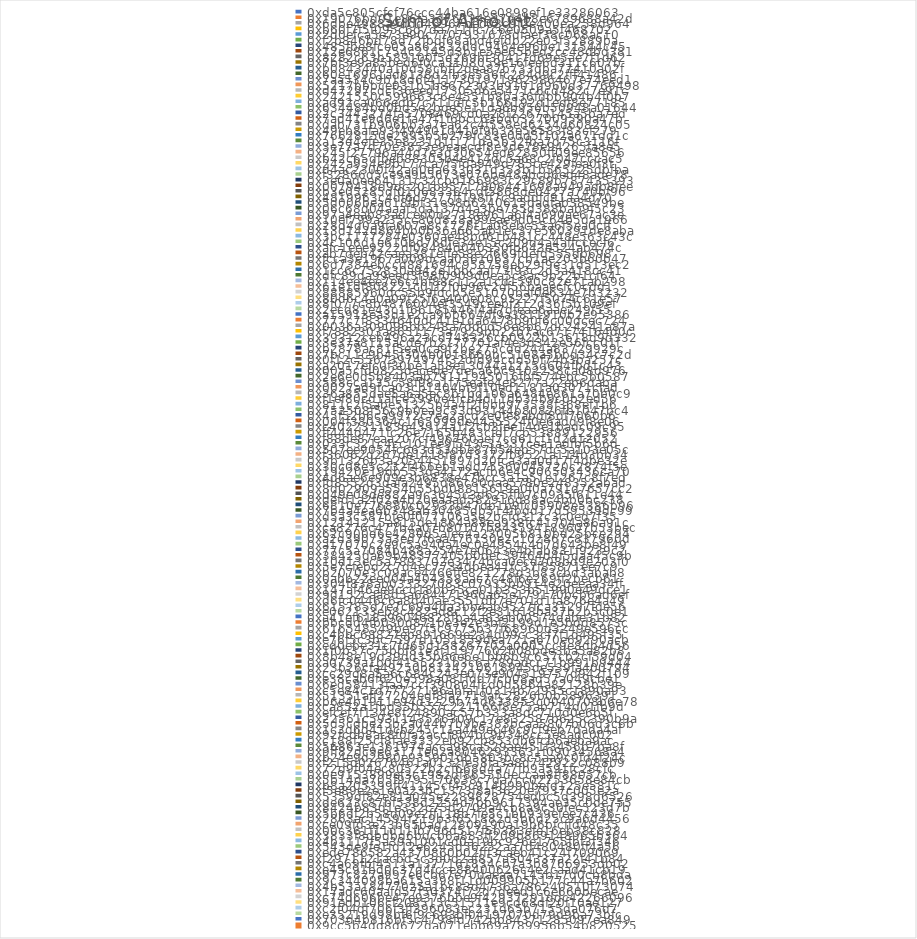
| Category | Sum of Amount |
|---|---|
| 0xda5c805cfcf76ccc44ba616e0898ef1e33286063 | 77777.7 |
| 0x19076bd01e86fa3d76334e27d4b8e6789688a42d | 38157.055 |
| 0x6dbe4988a9ddd46967bec08c9f2e400ea258d964 | 9176.822 |
| 0xb60f7f5f095c6d7da711ffc7c6e0509a5f468702 | 8490 |
| 0x2d0efca5e73e90c7707931678dfaef38c068ac10 | 8440 |
| 0xf2b846bd78d72fbdf68abd4efdb22e03f52889ba | 6846.5 |
| 0x485fbe8fce05a862832ddc9464e96be131544c45 | 5000.5 |
| 0x12e6861c754c2145d3b1e5ee65bed2cc48dbd381 | 3651 |
| 0x8282c63b589100f5d269bf30417d69e5ae7f1d62 | 2997.989 |
| 0x7bf3e9a85bed6f0ca5108059e16fee6d311c607b | 2997.609 |
| 0xb0843440a10d58cbff2dea87b733dba77410a02f | 2510 |
| 0x60e16961ad6138d2fb3e556fc284d9c2fff41486 | 2000 |
| 0x7aa534c9b18d6f4117301971962986467e74eed1 | 2000 |
| 0x5217bbbce031b5b8672303b9101d960d37769498 | 2000 |
| 0xd47297cdcf36eed17305d6a5471c6cd482c7e91c | 2000 |
| 0x2421550c599663c6e4551b8ba36fdbb904b4f0b7 | 2000 |
| 0xad92ca066edb7c711dfc5b166192d1edf8e77185 | 2000 |
| 0x634484bd0bd5e2bde5e11da6b956b50948a01644 | 2000 |
| 0x2c3443274fa5708469cd0a28f2267a145a5ba7ed | 1999 |
| 0x7ad41e9d6e1fa47f1f6bcc63bd0327009590a47b | 1916 |
| 0xdab731b906bb3a7ea62c4f558ed6254d60824c05 | 1519.89 |
| 0x49eb8afa93f494901d410f9b33e58583f83cf279 | 1501.02 |
| 0x76628150e2995b5b279fc83e0dd5f102a671dd1c | 1450 |
| 0xa13d4efe35e8231d1f171da5b32fba7d75c3116f | 1300 |
| 0x3e77a7d70e3853e9eaecdf8e3de78e94265fa8e5 | 1188.5 |
| 0x245f27796a44d7e3d30654ed62850ff09ee85656 | 1100 |
| 0xb42c65dfbeb88305b4e414dc5a68c2f047cccac5 | 1100 |
| 0x242a954e9b177ca7f5fda949d785ce429fea0f3f | 1068.868 |
| 0xd4ac2300f42ad0da633031d353b1b565225dbfba | 1001 |
| 0xf32866d5ce9a9b5673e076be48abcd6ed48ade78 | 1000 |
| 0x3e0adee64131c32cbd166983c29c89b787435393 | 1000 |
| 0x0079418d9dc201b95717806441698a949adb8fee | 1000 |
| 0xb3e05285df010683364cdf5868de0427a740bf96 | 1000 |
| 0x4819963c4df6d7277ff198ff7c9addfc91aa4d70 | 1000 |
| 0x5d006bea618fbf31e98d6240615dadfab38549be | 989 |
| 0x06c68d04aaaf5da137d4a3be785d388bab9f5c23 | 980 |
| 0x97a4eab83adced0d2718e961a6f4a690ae67ac3e | 949 |
| 0x10ef799a235cc80d828a99eae9d05c64b5da1966 | 910.877 |
| 0x28d4d0a9fa607a8c1726f1a08ebc55a6f5ea0cff | 901 |
| 0x13d142d864bb0b36a665ab1ec37e560391de8aba | 815.7 |
| 0x3bc1177284e0360ae48bd61b481cc448e563c43c | 779 |
| 0x4c106d1e610bd76dfe34e15c209d4a4affccecf6 | 713 |
| 0xafc1eee9222df08484d040350fb643e524ab474c | 700 |
| 0xab7deb42caea381effe58e2f669fdefd555db698 | 699 |
| 0xfcca3e1967a009dcaa05610637cb1ae203b60b47 | 614 |
| 0x6d7384ebccd881694c958758eb29f9e31d513ec2 | 600.004 |
| 0x1cc6c752830a942e1bbcaaf73f93c2d3a418cc41 | 599 |
| 0xdfc89da99eed3f98f0909d0ea5c8ac9b22b1cf64 | 550 |
| 0x114ee4ee7e6c4bf88c112a1cd1590c82e71ab298 | 501 |
| 0x61e1df808221c01f2f0b96c2df56baaecfc0cdd1 | 500 |
| 0x88885960dc55b9fdcb5e51070baf0e634e7b3232 | 500 |
| 0x80d6c4a0a09f25f6a400e08c95227f5074c61e57 | 500 |
| 0x8f077c8b4876004ef3549ceebf312d36f5b109ef | 500 |
| 0x2ecd81e43c1f66185446f4af7dfeaa6aae249f55 | 500 |
| 0xa15913ea3d1e2ca9bb664df9a3811910b2e95386 | 500 |
| 0x777c7f8334640dc41e1da6478b90f6c00dcec724 | 499.8 |
| 0x0036a309096bb248a7ddcd56e8b67dc24241a87a | 499 |
| 0xf7882303a8651173a7929bb22b7ac67174164d0c | 499 |
| 0x39312ceb496a23cd748326cb0922b13618d9d332 | 485 |
| 0x3e37a8115acde7b2777701af4e3d342e56fcc01f | 476 |
| 0xb2878ac81f5ea0ca9f2be275cdd244a83729929c | 463.671 |
| 0x7bc11c9b45f304b0018669bc5108a5bbd34c7c2d | 450 |
| 0x0f12c55673974974f32dfd94cdd50f74b3ba257c | 450 |
| 0xa2017efc0f30be1a58e13044a1215d604fbd1c43 | 434.244 |
| 0x00a5cfd0825dacede7deca6bc9102238ca08d976 | 415 |
| 0x2e6e0d5b8403ab79111945016fbf574ebc5b0587 | 409 |
| 0x588cca135c58f98a1f75eafe4e8277a22eb6daba | 400 |
| 0x0027ad9fca03cb1404bf9f10ed1181a03071cfad | 400 |
| 0x36a855dae5a6a5ec8b1bd106a6484e861a70b0c9 | 400 |
| 0xf1ef80cd1afce5990e4fcd4d11db34b9c0b2ed56 | 400 |
| 0x811c2f5abe51325b4a4f2fbbb973538f368ef1b6 | 399.997 |
| 0x752508f56c9b0ea9c53d93144b80826fb1047bc4 | 393 |
| 0x45f52b6ca9972c7ea2acd2e0fe8abdf8df7060b6 | 362.498 |
| 0x004f380364c1f65999de44a5524f0e6add9f8e06 | 355 |
| 0xc402231183643914a1f2cb3fee14de1badc09c95 | 350 |
| 0xff444d471fc26e7165b483cfdf7cb53889122956 | 345 |
| 0xf88de87eaa207cf496760aef7cd61cf1d2d12052 | 330 |
| 0x033c321c4cc101ee9f543c3a337cea1adfbf5b6d | 327 |
| 0x507ee9054fc663d53dbe87b54eb57dc5a103e05c | 309 |
| 0xf36062d267de1418f87d3372fb9521a114b3bb34 | 308 |
| 0x9b1326b3a2054451897d20fca3aa0d17f4dbe32e | 300 |
| 0x30c08e5c232f466eb1add75560045720c2874f5e | 300 |
| 0x19420e19db553da4172acfb6e4c906503436ca70 | 300 |
| 0x4d6ae6e909e3b6838e47bcc3a1a51e1267c8f7ed | 300 |
| 0xfd8552d3dafa2495d86c80daa5780e248352abad | 300 |
| 0x8d02909a554d55bd08815619a0f0a791d7657cc2 | 297 |
| 0xd49e08de882a9c3645c3d625ffb7c0935f611e44 | 280 |
| 0xdefd1a2f02a4b20eaaad582916d88ac4bb0bc238 | 280 |
| 0x6810e776880c02933d47db1b9fc05908e5386b96 | 262.1 |
| 0x7b4a4ea6b348ab30485db514fbdd17d59539dc99 | 260 |
| 0xd5a3c587bfe0f077106a5e2bcfd312c3c0ed7f35 | 250 |
| 0x12141215a815de1864a88ea938fc41704a86a91c | 250 |
| 0xca8276c477b4a07b80107b843594189607b53bec | 250 |
| 0x62c900d6e4280d5afec4a23005b810bd25bce294 | 246.997 |
| 0xa2d39073a3ed7f6aa476130e2c102867c837960d | 215.4 |
| 0xa17070c2e9c5a940a4ec0e4954c4d7d643be8f49 | 210 |
| 0x77c5a7084b488a254e7e0643e4bfab831f9239c2 | 206 |
| 0x38425da69b48377405b0dec39464d4f5daa45c9b | 204 |
| 0x10d13ec5a7893702e3474bca0ecd708bd9e203f0 | 200.5 |
| 0x5e7cfebd2c7d4ec7734dbea41fc37f85871ee7c9 | 200 |
| 0xb2070e3c09ace4466ffe821278d3b83cbd3abab8 | 200 |
| 0x0abb22eed04a404358aac7c48f6e269ff2becb61 | 200 |
| 0x304f838ab033327083c07935bb914e20eeaa34ff | 200 |
| 0x147af46ae9ccd18bb35ca01b353b51990e49dce1 | 200 |
| 0x9d152caa8d5a684471966a65e179170bcb6ad6ef | 200 |
| 0xd6fc0446c6a8d40ae3551db7e701d1fa876e4a49 | 200 |
| 0x615785d7e7c69a4da3bb4ab9527fca31297fde56 | 200 |
| 0xe062133eb8c482ad8c12f2e31618ba37b2b5c0e1 | 200 |
| 0xa41ef618a96046828fba4a83eb00574dabe31b82 | 200 |
| 0xbbcdd4fb030d871be3e2e3bf2199d1e5bdd8573c | 200 |
| 0x616548549be97f5c9775b37f68960d3249e596cc | 199.995 |
| 0xc4bbc68827eb891669e234d09cc3cf7f1d495f35 | 199 |
| 0xe76f5c3bc7597d1051859dea721a670e69290acb | 194 |
| 0xed0ebe31c7fd65d158267702a0005cc9e8db4d56 | 190 |
| 0x1f0b37c75bbf81e3f11977602b08bde3ba5a82b8 | 175 |
| 0x8b48e19d39dd35b66e6e1bb6b9c657cb2cf59d04 | 172 |
| 0xa0739a1b0f4155231b3c6a789adcc71b991b9444 | 160.083 |
| 0x23b26cfa49250b8124210618945de539fa400794 | 159.5 |
| 0xcc29d8a5a6c684c243e073e904519757d942f109 | 155 |
| 0xe38cab6f620e598a081fdd7fcb08ad57a049cbe1 | 155 |
| 0x6ed58413faa7ccf390804fcd0d5864a82128b39e | 152 |
| 0xc5e84c1d77727196abfa1f0314b72935c1890a93 | 150 |
| 0x51351aff27204edf8fa2719afc2826b0b5896391 | 150 |
| 0xb6e4b1911e94d3229b74d633853c0040708b6e78 | 150 |
| 0xca852a1fbd35b557c221166f8e75ab714d01fb9d | 150 |
| 0xefcef7f134e8f24890ac57b333a8dc710d0e6b5f | 150 |
| 0x22561c5931143536309c17e832587b625c390b9a | 150 |
| 0x5d5cdbe25b2a044b7b9be383bcaa5807b06d3c6b | 150 |
| 0x1c3d6d41dcb245c11a449ec46c9cf9eb7dada4af | 150 |
| 0x92fcdb8ac8f0fa2accf8b4bc9b348cc5e8adc002 | 150 |
| 0xc188f25cf8fae3332eb92cb853db6fcb6aeba9ac | 150 |
| 0x56863e1361974acca98ca529ae451f3456b7ba8f | 149.99 |
| 0x9ff82dc9e63171e02a80462933631f09034568a4 | 147.5 |
| 0xb24e9d2980e935901db5803bc8c5aa9c0fd4f24c | 141.4 |
| 0xf215d02676461a0132fe58fa3a8d742922c088b9 | 140 |
| 0x72d9f04ec80522b2cf668d4a77fb9a591fc28cfc | 137.8 |
| 0x0e9153899ef3c1982df86555deccaa8ff88057cb | 137 |
| 0x5b14da705f9795170638c7da7cc02753658e84cb | 134 |
| 0xb8a205399ff41145cf45c914b990befd125e581c | 134 |
| 0xf5e89e2e1e0a23bc1373f8af3620e7937c005e2a | 132.91 |
| 0x5359df82e81a045e2289828754edbc5d398d6526 | 132 |
| 0xde623c87bf538d2254d7bb9617394ae35c0de755 | 130 |
| 0x8424b83d1e332c75d2709a4cb8a9c30fec523d7b | 129.5 |
| 0x5b6df2b58d09e2ff118b7fe5c1bb939efee7c436 | 127 |
| 0x2863ac14594f219b3f651882d5b6d25c9a6d4456 | 127 |
| 0xce09fd3e23b65bad12809190a19b6bfcffd48c35 | 125 |
| 0x00c361f11d11fb796d517f5b383efe16eb38c828 | 120.006 |
| 0x3833f8dbdbd6bdcb6a883ff209b869148965b364 | 120 |
| 0x4b1117f5a39a1001cd0a19bc926e1765fbf3f346 | 120 |
| 0x543de9fe1fd12e6245d56252aa7d480480ff4a56 | 120 |
| 0xede786582a4370860b02fff3caeb41c24f709069 | 115.7 |
| 0xf2971121acbd3c3d0d2af857a504337a22f41b84 | 110 |
| 0xc4a69fbf4511a1377161834cb7a3b8766953db02 | 109 |
| 0xe45c91bd0c37d4fcce88400626c4e2caad41cb19 | 106.523 |
| 0x977c827a997e6cb67e70daeaa7145b17d0cb8bda | 100.82 |
| 0x9c344098ba615a398f11d009905b177c44a7b602 | 100 |
| 0x4b53a18477025a1bc83d4736a786240510f73074 | 100 |
| 0x17adc60aafd57f50374f72d7deed1c6e660becae | 100 |
| 0xc74d606be47e9376bbe9f42937291ddc42266096 | 100 |
| 0x91edb106cf208515c51511e9cd68df20f10ae127 | 100 |
| 0xc2f04df706f3ff396083ec231d65b7155da076d7 | 100 |
| 0xe35219d98bf6f9c693bf04197070d79d9ba73bfc | 100 |
| 0x703d4b816bf5c4798fd742bb84371285097ea849 | 100 |
| 0x9cc5b4dd8d672da071ebb69a789956b54b820525 | 100 |
| 0xbc023d8548390295ecf8d922df0c073eaa97666d | 100 |
| 0x00e307428042dc831229c0a4d74edc21d4ca8bc6 | 100 |
| 0x6abdc251e5e99b628ea4261d178e2661f59b90ea | 100 |
| 0xf6dd631279377205818c3a6725eeefb9d0f6b9f3 | 100 |
| 0xbf7571b900839fa871e6f6efbbfd238eaa502735 | 100 |
| 0xe79287c71913184170708887352f9146b56ce795 | 100 |
| 0x3179002cfcd5c4f65e7a8ed5ef27d1d1106cc673 | 100 |
| 0x6994fb3231d7e41d491a9d68d1fa4cae2cc15960 | 100 |
| 0x0719e9f01c0c947ada1caa50c65c6459887cc57f | 100 |
| 0x07f35b7fe735c49fd5051d5a0c2e74c9177fea6d | 100 |
| 0x7d3ee77db24e2f62667b116969a92d248bcef95f | 100 |
| 0x00006314ee6ba5a9421e4aa6a47c6867a882bd92 | 100 |
| 0x7e7613d9cb3ed1210c8a7a120ee4e4637aa29f78 | 99.997 |
| 0x841c83f4de5841d1c754d975390214d8999cce36 | 99.997 |
| 0x6cc0a09dd28c70bbc482252c54262a858d8d78d6 | 99.997 |
| 0x29abcce5bfee4c3eb4652e97a72bf740f44cda10 | 99.99 |
| 0x4213b891664be2fbf24a8cdc186d6aa3ee4c4b0c | 99.99 |
| 0xc7caaffbd29a249a96e6e1dfc54a9ab281e0ff03 | 99.99 |
| 0xc2e5e359db2921bbe0f1c6504153b9c97d6644c5 | 99.987 |
| 0x18b9e31443f0c6d935a2943df745d637ca7a0c4e | 99.974 |
| 0x7857f7bda2a45f476993d80c23814342f0b4f8e0 | 99.9 |
| 0x5a012bdf9013a016668d349816ef3de96b2037b9 | 99.9 |
| 0x04e7e0896835447fabfe4da2c9fce611453f184e | 99.597 |
| 0xa5ed81d73f71bf80bd108a32a770077d59d15a69 | 99 |
| 0x8f5876140d4ec58cd1f8cd3e0b0e6e348bbe9be0 | 96 |
| 0x09f3480871b1a3384f948841c29eee9c1392e776 | 95 |
| 0x3b015942a9f81a04111b8828e1335e3a78ede5a7 | 90 |
| 0xf249807c3706ad0cf9618b650ffe3f83939b1390 | 85 |
| 0x24710e871518e00bcc6b2467d2f066e8c5afe608 | 79.796 |
| 0x004c6b40c029f74081326caee4607cf384a9d735 | 77.15 |
| 0x95615f1c1fb4bac761ce4ffce6af6955b932b676 | 75 |
| 0xcf28898ec17ce32eda6495e4e3b856083ae385b0 | 75 |
| 0x962086e1e1058f37b3c45d88cad76afa6bc8455d | 74.6 |
| 0xa81ab4874f7b20cdf2f79de3bc0b0c61475d1c41 | 74.052 |
| 0xff2e66d01778cecbecc85ca674c9add96e91a427 | 73 |
| 0xd92599fa441adcf0931f9d6c5ee49596bd9cb677 | 72.5 |
| 0x1d0dcc8d8bcafa8e8502beaeef6cbd49d3affcdc | 72.3 |
| 0x5fff589fbbc063e61e35d0dc526b567ba0e5a0b8 | 70 |
| 0x34e9db6eaf40480a7c9812ddf8ddd25367523f97 | 70 |
| 0x6b200f4e534ff82117079b6cb7a554dad143e3f6 | 70 |
| 0x8a5ab552faa34c0de36a156c025cedaf78021252 | 70 |
| 0x751c447cbd3b66ec87964b832c59483bad13a4e7 | 70 |
| 0x53e04a24598bcf79f9ee9e3e67393f062b3933a5 | 64.995 |
| 0xa1ca4cb202476972f41a6611b787d5794739e003 | 64.495 |
| 0xaa7f0c57b28b5df5ed44a3f1ec887622ef7ae6f4 | 63 |
| 0x65ddc5a8b2548870a31eec2f0678f71cfd7c1a7e | 61.8 |
| 0xfa7ea17e3c4e7aecb99f662713f4789dcb426231 | 60.9 |
| 0x2a3b4986cb64bd5e4c6484282fb896fbe60b4e28 | 60 |
| 0x16d1d7cfcc38f419584d573e3e7b3a04b2840e1e | 60 |
| 0x378a848e973eca6b280f6caf238683b69d2f1603 | 60 |
| 0x03e2cbb43f80eaa27f80d713fa4e7e4d431da230 | 60 |
| 0x065471f3d083929fc6cd0c0e7e085f78fb7abeb1 | 60 |
| 0x4faa058b0f3eeaa5cf7a895c9629cadf2a45cd89 | 60 |
| 0xf7724ea9283f2f2676caeda493f718420e976e63 | 59.995 |
| 0x000110fad59080856750eb1762eae0021e032f72 | 59 |
| 0xa94a2c6af4916041aa60c12ddab7e0030eaed893 | 57.6 |
| 0xbaac86df8115c566c833e4f8b6b7b80386bd2372 | 56 |
| 0x06b94e6ee13c50b1ca68488ad471731889a49353 | 55 |
| 0x64dcd9c2733262031abfe744614d9ed5aedb0efb | 54.9 |
| 0xb190788690bbf75a3ba5a486f2b945204d905392 | 53 |
| 0x44c477ae778215e7b2e3d022dc7e0dae009a8560 | 52.995 |
| 0x3fe666fc563e5fa99f8e0e6988ee2070cea1fa6b | 51.5 |
| 0x50e65564353b3f2725d842f91ed60c6905d2a657 | 50 |
| 0x66fee5f438bad224ab0233b96d3d8cf914e085d1 | 50 |
| 0x9dd9ca89fcbf6ef99f7a4f4acc1671224a66baaa | 50 |
| 0xc81805f3e8534350e0669ddb3261417db5ff869e | 50 |
| 0x041dedfec783d8d6d8bd4f81cb3675042151184d | 50 |
| 0x23785f9002e7d43da1f617e212b2518026315943 | 50 |
| 0xf8346429a550b872893fab91aa5a53778dea7f9f | 50 |
| 0x0296edf4eb266dce6e3cbf44565beeb4a500ba78 | 50 |
| 0x009a6191f45a565b93b1d7524510fe5ba767588b | 50 |
| 0x00c6eda4b2d0a3172ed06501a8ece8f53b3baa57 | 50 |
| 0xd7aaa94afc543567a5789d8af41ae75a70df3fb2 | 50 |
| 0xa1a638d6e73cfa666fb614efff18d749067fa5f7 | 50 |
| 0x85947a5258069d2d4358760f13db05c210a794ae | 49.995 |
| 0x845613b87591b6ee4ce9dfcd180b2023d10410f3 | 49.995 |
| 0x28c27a92963fc001c41da298cd56d5b07a0cfd4a | 49.995 |
| 0xcc9483d25c5a7f3d9a0f9fcebde56161452f12fd | 49.995 |
| 0x4aedde4c569cdc72c3aaa349b3591a1560e42121 | 49.99 |
| 0x357eb1aa3168d769ad6eb3481299c35a797af52f | 49.9 |
| 0x6bf4f6a681526aa3375183a9fea5aea0b25b5e6f | 49.85 |
| 0xa51826379d5ff609371cd8f2dceb2d42357b1dbe | 49.8 |
| 0x96de4e91629d09b6f27557c653bbff65cfdb6566 | 49.45 |
| 0x483b9996bcdf15ac18f41b6e11719a1797b03edd | 49 |
| 0xc268885b122c6902ad79a1709e1cd080ec1f9eea | 49 |
| 0xf1e7b24c0e6df56ac6a75b2accd0244bcfdb9f31 | 47.997 |
| 0xa731f309389e699a8618a36f2af1e574afc8fe9c | 47.5 |
| 0xe208d2fb37df02061b78848b83f02b4ad33540e4 | 47.26 |
| 0x11f581c0e784ee455aba26a92e2c8ca2cce6ae0c | 47 |
| 0x34af3f64bb8bdc38bfd8267ea1645f4db2871d20 | 46 |
| 0x8c78f1ee67ed97af4f26561dc57e3757e734d0eb | 44 |
| 0x91319edbacd0292e247721d19eb7437150bb7fd2 | 43 |
| 0x3fd4af7d983c587d56199e4499159a2408953bbd | 42 |
| 0x25c8012aa1d5f306ddcfaaa29fea46e012ec8de6 | 41.2 |
| 0x21314ff1669aced72b3c72ad912102186cf5e1cd | 41 |
| 0xf59bf88fa2510720400a4187c3a4e17fcc8c1a93 | 40 |
| 0xdbdac7f902a093e0dab8f7c992920737a893eb11 | 40 |
| 0xc0f82fa8c0bb9d9222f133d3c842b6156b53932d | 40 |
| 0x90a64ed7b118631520ac1d71f348ff213ca51817 | 40 |
| 0x48f4c91c598102fcafff92f67bbca31ca7ae1fe4 | 40 |
| 0x81d5c63fc1137b957e7bdabf575a62c7dbb2949a | 39.994 |
| 0xef9761d46cee3a8b936c2a693f73d5112ee33bce | 39.99 |
| 0x875bd01ef7aed08a11b236833736174cc478e186 | 39.9 |
| 0x43774e0d4e94c0af3f1c1c3ff9edd5edcee5fe5d | 39.1 |
| 0xe90ba8366a7838f9335fa4052959c94dff783348 | 39 |
| 0x64615152ce74044b67f0b5ace567d6533ec22789 | 38.055 |
| 0x4e5b11bd1c0d0e06f0e61aa57fafd8581e9a0b0a | 38 |
| 0x8a654566edd646283c920e3225873fca5370f489 | 37 |
| 0x445a8b7cdc6448d0a158724c16a8907209e44cda | 36.267 |
| 0xf2cb9f99e5332449631370920844a97f2ac8ad80 | 36 |
| 0x7d3efb7c2e6e2725dc6ab1845673db1eb98eba0e | 35 |
| 0xde7fea21fe516d824641ae65f97b60552568e30a | 35 |
| 0x6e1207988b99779cd6835d5dd8b262a7f43e9451 | 34.995 |
| 0xdbde6ce8e80fa64429b4f2c740184a3960dc329e | 34.995 |
| 0x91f5296d426e2657d4fb16ef0f63411bb5a56338 | 33.261 |
| 0xa836c89dd3dea4e1f25fe7e6d1c65bd250e706a7 | 31 |
| 0x701a88d7817929e7ac68ea76d65594491b2a2a10 | 30.995 |
| 0x80e544021cff27fc91f39799d8343e68638a4405 | 30 |
| 0xe2e26e4e1dcf30d048cc6ecf9d51ec1205a4e926 | 30 |
| 0x512f16a8f646b72f22041c1a9ce6dafee9d86187 | 30 |
| 0xba92b88898d7f5fde1752cecfb03181aece0ddb7 | 30 |
| 0x1fbdf165ae35c0382156f1876bab65632bd4ff41 | 30 |
| 0x5b60467a6d76643cabbdf7211e541fb2559684b8 | 30 |
| 0x07ad11466475ad71aa89d7bc48bebfa4e1e162ee | 30 |
| 0x46668a7d0a4d9c07d3513d2d74a5ca0cbce047e4 | 30 |
| 0xd172e12d8fb0185598495ead709791f3b384fa27 | 29.995 |
| 0xcb34c1ccea05fdea4f57bff8b83b919ed9f51595 | 29.988 |
| 0x268361d457ef1634081c0a5ebed3694a7463d1b7 | 29.984 |
| 0x66533e26043d95aace2a97f306b1c62876358a64 | 29 |
| 0x3a289ec90fdaf63555227ddb016b6d1a80a38703 | 29 |
| 0xf8dfaeecf78c53aefa477aeaf1a992b251f4368f | 28.79 |
| 0xaf6b01586af8b1527f9c6e84e0070b099ad56f09 | 28 |
| 0xe7aa7aeab52b8479e2c04a5af79ac0862265ba62 | 28 |
| 0xe1d75e3faaa0756609c14ae664b4f97c038cdb66 | 28 |
| 0xb36afc551ddefd0cb4564df22991d1f3fad6a7d9 | 27.5 |
| 0x6622131c5fc8b19d7b52b3bf62b80dcbb64ed138 | 26.583 |
| 0xd07f8891a0f9e26651094a44ca1c51865632617a | 26 |
| 0x33ba0953234fd6986a5077235ddba997b088a24a | 25.98 |
| 0xb2f0ac95a1c08454362fc32ad6ae0f2bad366004 | 25.5 |
| 0x753dfc80b4f585b0a47a05e0ef18c17eb98c0784 | 25 |
| 0x04930ccd1e3977a1b45788ae99c8b76daacb7a82 | 25 |
| 0x971f229b5aae7875daf68d35a1b21926e8895097 | 25 |
| 0x00acdbec028172388149482cc83f285e9e05facb | 25 |
| 0x631b40d0ad3fd20315f3c7b7fb09662c97541de7 | 25 |
| 0x40a0b2c1b4e30f27e21df94e734671856b485966 | 25 |
| 0xa15ec67b3daafd655c232129ba1633ab2f304fe9 | 25 |
| 0x5ce259aedcd14038ad2c35ecaa7b6b2974d339ac | 25 |
| 0x06608f5ad0101bdf2786a6a47fc694c88a625a73 | 25 |
| 0x1c3af2e277bbc0f412a0e55a897eedcb9de72953 | 25 |
| 0x9c5083dd4838e120dbeac44c052179692aa5dac5 | 25 |
| 0xf6386dcedb811e9d2fb3b2a45fad5ef0f45401da | 25 |
| 0x42b0f0976fdea2bc68455329ffa80410ecb825ca | 25 |
| 0xcc58018e9d8e1b041ba39d97223b4e47fef45dbb | 24.997 |
| 0xf5b6c17e9dc7d10d71dd8382c98c3ec88ca08ed5 | 24.997 |
| 0x3381b2e75086d113daaad7bf7434f8332331a348 | 24 |
| 0x3b1723e768dd7a928e4ff966c63e44701c9e6bcd | 24 |
| 0x6e3c904a2db3b5efc7b619257d5127f39ca2653e | 24 |
| 0x5021ffbdfca81d34a91c8ad5db1aad120d35c696 | 22.084 |
| 0x7b1bf53a9cbe83a7dea434579fe72aac8d2a0cd0 | 22 |
| 0xe5df2e6dfd03263d81eacb5c80606b0008860b10 | 21.256 |
| 0xeb9c90916447f2450be21e9f7786d5236e5bd57e | 21 |
| 0x9dfb2f4a8d89120655ddc687b84896d0eefa0e9b | 21 |
| 0x38e03af4c5453985979a49ad5c1ec0d7bc3ff679 | 21 |
| 0xf37a0b5a70ee29dc796485b0d34eaee72453d9ae | 20.994 |
| 0x42ce6da5551ae47934eaf20724b53b56ea6677ea | 20.99 |
| 0x67e3a2511e63160a253684ab88e996b4b6bbaeea | 20.077 |
| 0xba20cadb3066492d34d2737c7d6371f5bbab3525 | 20 |
| 0xafb2ed195202999a69f8ea2a28bcaef7d0574c17 | 20 |
| 0x7b695420f8c2703f7dce9523728fe7f055733247 | 20 |
| 0x4a80b762ff7c8322a7285c81f1c4b4bab083182d | 20 |
| 0x627d1dc28420dfe686ce027671c26a175a6404d9 | 20 |
| 0x7d800c1b5cc96891bad2113bc25322ea65f8f032 | 20 |
| 0xe7066e2fb60a57e4a266008f33b2311f7dbdc736 | 20 |
| 0x8b8aa73e3bb0a9208d351f12bd6fbba533b36d64 | 20 |
| 0x6dd5f1bf1ffa6a3173e333c1588f4cdde8c6799e | 20 |
| 0x86c2c306ee299810f172db4b1c5b6227e81c0e19 | 20 |
| 0xa6d549dd92e5b2844529e18af7094e8587499a46 | 20 |
| 0x88f6bdd639de60b2f096f65dcb2a238b97cec6be | 20 |
| 0xe801fecff140c256e25cc9fa38bb2b2680c895fe | 20 |
| 0x16af41d7d554e5814b2a906b2ac27bac06c9a61a | 20 |
| 0xc4cc5d311bc360584ea6658f0d5daaea95dd31ee | 20 |
| 0x556302d9d1f5a9eff221fba4a55fd84fb71a526b | 20 |
| 0xd2704524655647e2ce193df288ae5b918fc219ee | 20 |
| 0xfb2fe8271295859a21ea086f98329c9ca5a2ed9e | 20 |
| 0x48201c1dad6e53ab497153077e186823e6634c45 | 20 |
| 0x003711b4d497959ab688be58b713c4e3454ec924 | 20 |
| 0xfcd41b207549a2eea6d4c45fe36fad80f237d006 | 19.997 |
| 0x3c9efa756aa0cb4efc3a77ed324fbd4967f5fe63 | 19.996 |
| 0xba4326c43249c0c69249194724049624b34ce23b | 19.995 |
| 0x0a986b1da7f8175391dfe2111300cf90829764fe | 19.99 |
| 0x059aee6e70ac7902ad050df80cc5b664d37f97cc | 19.5 |
| 0x44183130edab544d30c8ff23ccd80f6396edb9f6 | 19.27 |
| 0xc9acbb5370add6106874d561b228a0695cd8cf5b | 19.17 |
| 0xaecf86339f4d289f938acf75567f6ed64803f015 | 19 |
| 0x3fe940ec45ed7241bec230387eaf4d08cd142e90 | 19 |
| 0x9e267a1174891b5c8a96571977e5092ad68af495 | 18.3 |
| 0xab5cb892109510e8fb51b81c4f15610339105bba | 18 |
| 0xf106ce498fce313dd7767d0e6fdcb63fca72822f | 18 |
| 0xc6a286e065c85f3af74812ed8bd3a8ce5d25e21d | 18 |
| 0xd87134651dcb1ca7bb3b4cd9be9444db11c210f9 | 17.52 |
| 0x313575aec984a0d1d755cb28cc770e50d6bd444e | 16.986 |
| 0x8450dc9630511500be6bc9c44f928444b3919231 | 16.8 |
| 0xaf642a9c8b04e5d98da0e4d97882eec1622d15ed | 16 |
| 0x995577028cde23ffdc25b4186f8fed74d25eaf97 | 15.997 |
| 0xaf3b2bef0e2b7f6039733396056b8a71d411a659 | 15.995 |
| 0xb6f6d7d3ae92c0dc8ff3438836e84e5fab4c431b | 15.8 |
| 0x74fdc967564af1c864e89d2a160625c61db69702 | 15.505 |
| 0xff574074bdc23f333abc425cfd99076f51d8e881 | 15 |
| 0x56f97d34de8b39fc321b98f50900eb64e5e4ccea | 15 |
| 0xdae4d2c84046e46da756fbf664881e75c55b0808 | 15 |
| 0xed7909a870c498bfd8584f248912637d7d90a1db | 15 |
| 0x99965345280551426757cdf170d1c3f5fd3aff61 | 15 |
| 0xc69e6aa8f804914502033d0b9d8608e9d7986576 | 15 |
| 0xe80d5919a41466e0648005d12f57fc00e35837fb | 15 |
| 0xc9559773b3a0b92eed1150020e7e5d6ca9ea0348 | 15 |
| 0x0736f65100bb1710296275d733e84bfa22371605 | 13.997 |
| 0x5dc74edff6a93ac4957e3f7cacf02b48f76e1d3d | 12.464 |
| 0x96e589ae0d6c8d5b4e3f893ce4895f815472034b | 12.282 |
| 0x6f93f65c43dff24ef9cae3f27cdf5f7a63b036d2 | 12.002 |
| 0xa6c9257460ae18912d8c1c65a163dd233235b6f2 | 12 |
| 0xbcee238d154c6352f6e7978d33470618f69b81ff | 12 |
| 0xf6a51b2051b72014c29614f9e823927975002992 | 12 |
| 0xe7c2aa3e3f40541d65e412cd444ac3446b5c06f2 | 12 |
| 0xe8faec39e5dedafac427b1ec30c9a87d646360a6 | 12 |
| 0xffb6781148d1f2b6415c25dfca2ccafcab4099dc | 12 |
| 0x9da1db798a30c424dce83abc6ec529beabd4233b | 12 |
| 0x44ee99250cb42d4c842cac03282f4e3ad7d782aa | 11.6 |
| 0xc7cff37f61e120db781d078ec3979ed4efaf80a1 | 11.5 |
| 0xf36d081965a0deedcf65178261fe83ce29340292 | 11 |
| 0xedea79af2fc57373179a2b70d5aac397d4bf571d | 11 |
| 0x9fdd51b3ab2cc2ba62ca4ec5238a6a14cf381c71 | 11 |
| 0xab050ab59ecbabb672694dc186c0c3101ca02950 | 10.987 |
| 0x8a8a7f2a54a47aff842c7b8eaaca5dd2f2fa4943 | 10.65 |
| 0xa56071c0c89a99c4620e36292b16fb215ccee949 | 10.5 |
| 0xf68c21b45a72b64f567d26c95c1842998a0cbfa5 | 10.39 |
| 0xf8173a86bf7d817278f5bffe6e86ca629eb0e2f3 | 10.096 |
| 0xc5f7ee146eacaeb3fbc2e94926f30b83e3bf80b2 | 10.06 |
| 0x995330e37b8642cd0ea97ddd1a5e42c0d6c1cb37 | 10.01 |
| 0x47c511960e1762d0e97c21b949a6a1d2d93b6f14 | 10.005 |
| 0x454f4e3d0c40cc1e146a4ce176321fcf73790868 | 10 |
| 0x818c69a3f3bd436087ec101f0ff8aa2d3cd35e62 | 10 |
| 0x5eb1ca2d9d250ffad144c7b6f0191fafc97ae1ee | 10 |
| 0x2db8fa1726f93e8700c07fe368cc631a9998af81 | 10 |
| 0x929601ae8699d85f25e6a66a5658253efdbabc42 | 10 |
| 0x4cd7a2ea3cff43b21b1575c096e693a2601e9d8f | 10 |
| 0x40fdc729e61ab661181246d822188ac08513dedb | 10 |
| 0x471f3522eaac53133bca7c5c766e1a06a4414f26 | 10 |
| 0xb06d958cce8ced5b26ea37e63d26a3a3a0d3ab34 | 10 |
| 0x875e70ef4561dbf138266dfa3275a59a65b1779a | 10 |
| 0x6387bc737c7cb10c366f1da8c8d0e844760f56ec | 10 |
| 0xaa7e9c416ecc7c1fe13e2f945e38f438988dc0a0 | 10 |
| 0x08470155945fcfdd37a40f58c7e28cb3681c3f84 | 10 |
| 0xed293e417fbfff68451af85dca1a1f1365bce2f6 | 10 |
| 0x2f8d05f3941b374f9d37ca8fd0c31ccedafed1d9 | 10 |
| 0xd8a405518bc5c1c089810362292cf5853335ed25 | 10 |
| 0x55b62f1e364c33475b02d019830f1504ec48f489 | 10 |
| 0xe381369dc8c1babc6712d10d9b8364691d0efbb2 | 10 |
| 0x0f0b102033ed1fd0b6af11d6f89e8b9b06166264 | 10 |
| 0x741905e4b5f1f6ab55477991657294dcfdc4475a | 10 |
| 0x9c970f87d8a6deda65e31215134b6379202a0bc9 | 10 |
| 0x7c4b4151a62aa37fc2946ec7a6c638a170f4f290 | 10 |
| 0x46b396728e61741d3abd6aa5bfc42610997c32c3 | 10 |
| 0xe34e2df841e5a6352b0ae8bd5a797544f11d7e89 | 10 |
| 0xa626fbafab74c98a6587673ab6f4e9ed9ff00b11 | 10 |
| 0x77744a927271f12dc5b9b8887064f07c37648829 | 10 |
| 0xf9fd7c19a7c5e437fd38bc2edba4cb66d1df602d | 10 |
| 0xbbb33d2e7bd7ddc722e53da9ca8ee97df41cfabf | 10 |
| 0x0fa38abec02bd4dbb87f189df50b674b9db0b468 | 10 |
| 0x0031ff4e3c9b00f53d622b9361fe2a86265cf324 | 10 |
| 0x5f257d2d8d12db64574a5548e16f9f10dc0aa5a7 | 10 |
| 0x69e3e1069d4efa3efa0529da3868151ab3a7a13e | 10 |
| 0xa63ddb00c28b4e753b44610dc4d960aaf1dcf6d2 | 10 |
| 0xbafc582e9ca06fc61f9417d589af9d0dd4d51f49 | 10 |
| 0x5487314abe5d19201dad26193eddd918a69fe844 | 10 |
| 0xdb88b5b807f3821fa735d99859ef4fc787b6eb98 | 9.997 |
| 0x1731dc9ad66a910fae1c7c066867db45d77e9650 | 9.996 |
| 0x2ed58e4dc4e58c11152068a94a93525ebc5241e2 | 9.995 |
| 0xe95663b7edc946897b1dee7b619f05a17d4be2c6 | 9.995 |
| 0x55952c321b45cc21d668d7a3e42f845301b49f31 | 9.99 |
| 0x9b429acbce12bd7e5254a9fbb1ed045f20cfddb9 | 9.94 |
| 0xa61987e2c39166f7fe823dc29cb14d56b2ec9f9a | 9.41 |
| 0xfd4e15b4dd20136a9621576743893a17d4dfff2d | 9 |
| 0xff17a3c1e9807a7bbdc014ae0c645b20e09b93f6 | 9 |
| 0xae81977ad1cf9c1a35665dd5c45e4f21c6addeb9 | 9 |
| 0x3f3532121fc527f9771e8c2530623fc51693e8b4 | 9 |
| 0xc8f424b473398d6324f28b755cff51a02e26254f | 8.7 |
| 0xea56152d94d6dc1d69c90e1bb4a2ef8c79d4d49d | 8.5 |
| 0x0ad0e5b722e8d66f0f89d41e65c400ff3461f4ae | 8.45 |
| 0x3955e672f3306fd39545edb3d7040cf8de2f9180 | 8.4 |
| 0x28aa26ce7d649a67cab486a6a31be0e7640bd3b2 | 8.149 |
| 0xc21c3ed8d218fe804459311bfa4674b618c39260 | 8 |
| 0xe509c5903a028597e7b80ff5a1be6a23d4e7ad33 | 8 |
| 0xfe88dd131d675874d8475ed6d3e3e92993f76d51 | 7.99 |
| 0x8e65b5da5725a6da0dbf5c886fbe760d658fbf61 | 7.98 |
| 0xfd1bd9122e712ed08a7112928b4f7e7169028cfe | 7.9 |
| 0x9491dc1488b64a1d136f9b9790cc2942ed83ef0b | 7.5 |
| 0x3ea099878198541368ab67785388206a00483516 | 7.49 |
| 0x6358f1f297f3e86a7a107968396d52b2f4276c7d | 7.45 |
| 0x63e656e68b2e411f846e3ddcdbb34f448b86d462 | 7.302 |
| 0x6794fc5f237531d73fd32653d4f6787ac06c2c69 | 7 |
| 0xfd7c450df95b4aca3aca6aaecf6a5848fff6c2c4 | 7 |
| 0xc5a81e5dfe05a93d1d8e28131d087aa8c55e63a3 | 7 |
| 0x829aa02de51d29c6d4b3ce80b7a2c084831899da | 6.997 |
| 0x46fc2918149fc32448374731da3ee79f4b9f9595 | 6.996 |
| 0xa1f9e29a5999eef1cafb06ce9fe9286de25c1a56 | 6.994 |
| 0xdebb3a4c1b757c20975f49b25d32663c33e50399 | 6.9 |
| 0x3cd65ea2bd3a6e7a05885a89d0da2bbf795be388 | 6.803 |
| 0x3fbe4b86879a206bade409b1d445ac4ef15e409d | 6.4 |
| 0xc08b2a33d1efb1d1aacb9216f3695b7a00713518 | 6.35 |
| 0xa898f9acfab4476153263029f0b826ea669f3c2c | 6.349 |
| 0x865e6b25048f7efaec4e2fc5f4cece8a8b5c499a | 6.175 |
| 0x396084a3a29a8286ec10cdfb0c8c7154fbbca4d9 | 6 |
| 0xb87d9edb23e88bc7c1e6f2cd3aa65fae6397670f | 6 |
| 0xff3bf47f687d90e764c695654054ad40932dd9de | 6 |
| 0xbbb10e9053e029bc5d4b9e16a469a36ae14aebd0 | 6 |
| 0x739084bdcd3a2a0aa10bd573f2c0ba2cb2e7494e | 5.996 |
| 0xc6f08dabdf04e895eab81468075ee8dc9d04e1d7 | 5.948 |
| 0x3770fabe9c19823233ae284ab154547603e0ed73 | 5.9 |
| 0x3637f645f8bdb74e1cd1b28b5afc64c4a29c1f1b | 5.5 |
| 0x3a937ed6ecdba890c0bb18a2a935fdeaa0551264 | 5.497 |
| 0xde61db4f37fe279e7be443bf84a94e63cb690441 | 5.1 |
| 0x1bd24f025682c819216c0ccea4898761b57524b1 | 5.08 |
| 0x8ebae6cb0131d6cfeae8d090d642a75285641ded | 5 |
| 0x88c0a4496f78b987c189ab7da6bc1a3e660e5f71 | 5 |
| 0x6238ab3b3a323270b88b28a7619ef666396578d3 | 5 |
| 0x848d4791016ba03801a7938647e919c8b5d6dcbd | 5 |
| 0xb8714b77f9452720c0e16663dd56b8e850c7674f | 5 |
| 0xe49c85e5f5189653e4c9e4331067d99ae8f06ca0 | 5 |
| 0x000ebb8b36ed2fa0533d54c7134cb423743fd0dd | 5 |
| 0x1618fd1bfe7ff77f9efedfd2cf271bbee11d3faa | 5 |
| 0x0e3a6880ce160f1edc3bb91e60598de92994d876 | 5 |
| 0x00730fe3aa6b1a1322933e6263f55fababc17eb9 | 5 |
| 0x0038f3843c67080c93489a5a77f0598f100bc210 | 5 |
| 0x05e7a8c085a64d92ae0862393f46d41ce885e2d5 | 5 |
| 0x76a7f27e9cabdb62179f7c7ab6fc340693b28245 | 5 |
| 0x5d8cfdca4778624db4c05581b44f1ce857ddd873 | 5 |
| 0x451a6cfdd3699293b56aa27a35f27bd300fd9b51 | 5 |
| 0xaeed68bfad102eafbec2bdc47bd5ed9d228653ee | 5 |
| 0xdf8fa8c4791f79e102c4b7a1eb980084e4f19a99 | 4.996 |
| 0x78665d8b99f12dcb2ea38d4bbaee38eba0e3427f | 4.995 |
| 0x4a3d8aa71ed4c5f21bd353b3689f52fc48da1f9a | 4.85 |
| 0xc22cb3489144372d6f4643f6ee547a7c55ef04fa | 4.6 |
| 0xc4a5107fbbf9907158e65f85e4f3bc931d9879cf | 4.5 |
| 0xac79c6d3a56aad22e54c4c8bb8da0278cdaeea68 | 4.5 |
| 0x8b6409c4a9aa79671107df488567a497c8df1394 | 4.495 |
| 0xc4ecd52364f6a8ad29dfff149c6fd5ea1bc5bd60 | 4.436 |
| 0x84679b26fe514bb594e682b02b5a792f4111a784 | 4.38 |
| 0x2514109d650dcc0b630409c6a8e3685fecc5712e | 4.28 |
| 0x9d7aacd6d0d57fa82b8160bca63387d98570787d | 4.113 |
| 0x19aaec55eeccafcac109c2677567504ec7bf63a7 | 4 |
| 0xd3797c56456a126fa4fb769714b988b34fe51542 | 4 |
| 0xe3362375921fa33ee4e6e8e289c2b9fd8b645eae | 4 |
| 0x0891bd2929f4405e26b8d9fbe58f267f3ed3a6e4 | 4 |
| 0x6a79af7dd5981ee5bb07282d5c350feb79c50978 | 4 |
| 0x9ab1771330a7486b6eba69f515044e0c7c78a28d | 4 |
| 0xa9348ff37fc6fa8048092785ac62c3847310085b | 4 |
| 0x1a5755d49fbfb675599863a491af333c04f9f4ba | 4 |
| 0xca74b142b51fab10be106836cb1157b7cfd29b38 | 4 |
| 0x90302fc34bf4401b34d73249f9b454ed1eeda6de | 4 |
| 0xdca158b16a64ffb25e5b810c38655b4937d647eb | 3.99 |
| 0x07cd2dc37bfdb7c0693b97278181fb466e8cb33d | 3.98 |
| 0xfbcf238a7846886dcdcb46a211a05fa16635f730 | 3.932 |
| 0xce5e16a5c9b79393fec673e94fb574a74e9b400c | 3.9 |
| 0x427979d95f1be9a1d02b17ccfac4439eca46aa29 | 3.9 |
| 0x9c8ad2e81af897d2a745cbe5fb8f75f35308e595 | 3.795 |
| 0xc151024520bd4e16e5ec2b38c047db8cb6cf6cce | 3.58 |
| 0xb905781eebe4bf3b92404527d15e6b5e8d80c059 | 3.5 |
| 0x9b7ad4eb4f39bcde0397dfa9686d46b54e2a4fed | 3.5 |
| 0xcc647ad7e852c231fe34034f1bd9c88ba1b0b327 | 3.495 |
| 0x56b4739ba7cc3e4508d75b7c4df7079f7939af95 | 3.123 |
| 0x023bef4d6c167f042b4700fa4abf7d35ae02c1eb | 3 |
| 0x2bc44e262a2ee912989620b73b7bd0218e5b6d5a | 3 |
| 0x1b243046809d11bbfa07ddf5839ed3117e689b67 | 3 |
| 0xf166bb80b5dbe9cf21e8382b804d58e87fd065d0 | 3 |
| 0x5036993648f9dfa2cdcd26d6b1a3c1a4904fc579 | 3 |
| 0x00d5dad9ef63e616a004c4da739f6b9bf21e67bd | 3 |
| 0xa3838e11ca8b24c964f8323a11890fb371bc525e | 3 |
| 0x002176cb83b3b5670fd6231bd92169346fd49227 | 3 |
| 0x583b18fe8144e4b0bfc58ef8cd3760ec70e316e5 | 3 |
| 0x5b290d42956e6299cf6f1b8e35ae4f7f32c2829c | 3 |
| 0xa786bb00721bdd9aa4ad949f6aebd20a7e951938 | 2.996 |
| 0x019641f4be56a197bb27a7c395c6ed0bdf76970f | 2.995 |
| 0xc74c896f34b94885124bddfecf093a6b1012fb1b | 2.93 |
| 0x78bd46397eca1982887cee4ecb138c68f19f9803 | 2.9 |
| 0xd253737d80cfc27cb543603b603764b8b10ef962 | 2.5 |
| 0xc6ec411cb815c46a27b1c05b181aebff6bb937da | 2.5 |
| 0xc97dc8e2b7c81c63453cfc1e84a74ea365854b48 | 2.5 |
| 0x3b7136d100fa4cd25dd2c85f51270aa5d8cefa4e | 2.496 |
| 0xe12629afa054fd72896c42c15d4a1f2100f92c7a | 2.495 |
| 0x8a2187c837f3580d91535e030783d4bfd2dc95a7 | 2.452 |
| 0x92aa3e8c364273df6de18d3b769b07ca2bd11163 | 2.262 |
| 0x237cfad94c4fa00c24aaa4abf0aeddc86cbd6966 | 2.197 |
| 0x9b928173697db28b0a10dd8756914cd85eb8f66d | 2.184 |
| 0x295200aac39cfd2dc77bde81d0240ca88072a581 | 2.1 |
| 0xc1f9bb72216e5ecdc97e248f65e14df1fe46600a | 2 |
| 0x75fc1afcbace7d9bb73e7435dcd27ff28a965e39 | 2 |
| 0xecfffd759275dacf003ba44ee8fd3db4862618b9 | 2 |
| 0x3b958f8176096b0efc546c872bf2af3bccef5009 | 2 |
| 0x098a5d6803ce7614f52df4eaf247e9c4a7e260d8 | 2 |
| 0x05d96e199c7638a815bf549b9dc7ec3719c04e1c | 2 |
| 0x4619fd7306c66003a0c9261f7084526a7f9e7a99 | 2 |
| 0xa249996c0c78a9bce66dd5d17aefe8e277a59c64 | 2 |
| 0xccaf9c927e6354c2b394e3b06f8416f311d5e2e0 | 2 |
| 0xdd4a46e9c8c8b8d836d7501e85ecce90ff838995 | 2 |
| 0xb0971751696b76a40e8805f0fe6ff0606a2a891d | 2 |
| 0xaa8bbcf4de7cca4dabe1d82681d2343bae9d4123 | 2 |
| 0x3f45f6d99dbae09c1e4410d0607ce155761f0dc1 | 1.997 |
| 0x4862ebedc8a2da3f56eee2cfaac73a34c55c7d99 | 1.996 |
| 0x704f587da421db1b8069b8bb722335dc38396466 | 1.996 |
| 0xa238d557829b8c1fa687b751992b41ced8d7da3d | 1.994 |
| 0x0fe79bc0d54010859fdb34511f4ec6cca4e4f495 | 1.9 |
| 0x84e7b6a28b2f9d041f2bda715952ebef1727d303 | 1.9 |
| 0x650dcc7399efe5f1dcf0a0424cd1a4b0079e3042 | 1.7 |
| 0xf9ac617fb0e9dfe6f59d4b69d9d1e4bc75af2bd3 | 1.6 |
| 0x931ec18352c8259d9fd216ada5eb9e213ebe41fa | 1.5 |
| 0x2bf6b7862217021ec2a611bc347b1e74a3a253b0 | 1.3 |
| 0x62cae2148fdb1558b46d9e24e3464fbf2c2c6736 | 1.219 |
| 0x1405ac5da9bde5034281739f7baae9ca8e17df02 | 1.2 |
| 0x55142d5c63ddae33df371cd450f9208596c99821 | 1.158 |
| 0x00779e5e4558c02673eb64873de7c1047d6e9f64 | 1 |
| 0x0a896fada5c1b4bb187a4bea3afca092cb2e93ef | 1 |
| 0xe79de7367447ee480ed7e08c9c56a31a5c721b35 | 1 |
| 0xa31d22c7124b5c5072f7a422d651dee2c334bf70 | 1 |
| 0x5b345628c40a42bb7baeec062508cc43144f2377 | 1 |
| 0x8ca190f0625fbc5050edfc61e006e4d3b4fb9591 | 1 |
| 0x846fe155673f9fd3131be9b757d1ed9bd3d4853d | 1 |
| 0xb6368e48142d21c69b49c1839bd228df8e9a3215 | 1 |
| 0x81b15bd8dd3f6dfff5c3bd8db1ac620c79262ca6 | 1 |
| 0x02744180a280b439ab46d93fc0d8dffb17f3f019 | 1 |
| 0x005ac6e360f3894e1377375994c31de12e044907 | 1 |
| 0xe1520f37bd5d927249a7155d0b7b520fe7c04831 | 1 |
| 0x6e33930ee57c88ac4a0921f83b11f43a7053d98b | 1 |
| 0x0dcb6c4929bf48bd893ddab45acf114032c65cfc | 1 |
| 0x282568026b255a616059122b58dc71211f112a14 | 1 |
| 0x7b4043e66f999d333edf01d308734137b222a73e | 1 |
| 0x88f78b27b0eab9cb2f9108808070c7aa1e6a88b8 | 1 |
| 0xb45a840ee5b4f4110410426042ec88c55c8db92f | 1 |
| 0x81023218d2d47d7bf5def0cbc6292c9029f5ee8e | 1 |
| 0x65cd5eaec1e486f1bebfb18acb311f86f129a5a2 | 0.996 |
| 0xdd58a4294ddac2a46a0fae4762d1e4afee6991c3 | 0.99 |
| 0x001048c640325e8612b479922197d8acb0ac1c83 | 0.98 |
| 0x52ba87f81629dfd9e08b5c562812d96e40100940 | 0.804 |
| 0x57f33b02f9e35eb692985e258740b1fff228e28c | 0.8 |
| 0x3edce24b48fc05e48bf4a75bfc3ef31965fa62c5 | 0.78 |
| 0x6cfa6db686e79b707909a422b28adf947f66acc3 | 0.695 |
| 0x0622e222d7ecb07f062b0d5217ad00e48ee15ae2 | 0.5 |
| 0x1dd2d8becef4073d49edda5bf451cd6ccf748929 | 0.5 |
| 0x42149e719a9e36c57d00ff1c130dbe8198f13e8d | 0.49 |
| 0xd80f9431dde9b04829c2270955fa63808679c910 | 0.49 |
| 0xec07b2a1b8f5a5e82ced6362c6b8e7eca523657a | 0.4 |
| 0x45f6b760829be9beefc66fcf238aab17ea643095 | 0.257 |
| 0xb2000016f110f9429411f6e6e9619d76e76cbc22 | 0.25 |
| 0xb473b019ee0aad02e213f5f910cda9e2384632fd | 0.2 |
| 0x31edc1d9d73b35f379b97831198f59ba05ea6d33 | 0.2 |
| 0x0cac020bf6860d1276a1cf9cefdc9912b477c74a | 0.1 |
| 0x2186e605f7698a45edb81eb4b2d98d9aea663e41 | 0.095 |
| 0x1c97bdc39ec9def0049f7c8cd9d1bfeb1761d430 | 0.064 |
| 0xb425c25a09400a2ea9d7a91098a40dd1ee358e70 | 0.06 |
| 0x632da81d534400f84c52d137d136a6ec89a59d77 | 0 |